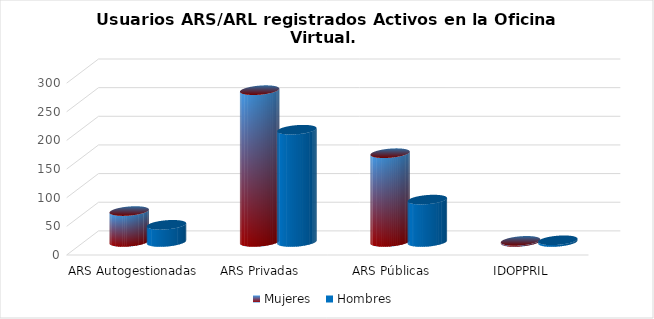
| Category | Mujeres | Hombres |
|---|---|---|
| ARS Autogestionadas | 54 | 30 |
| ARS Privadas | 265 | 196 |
| ARS Públicas | 155 | 74 |
| IDOPPRIL | 2 | 3 |